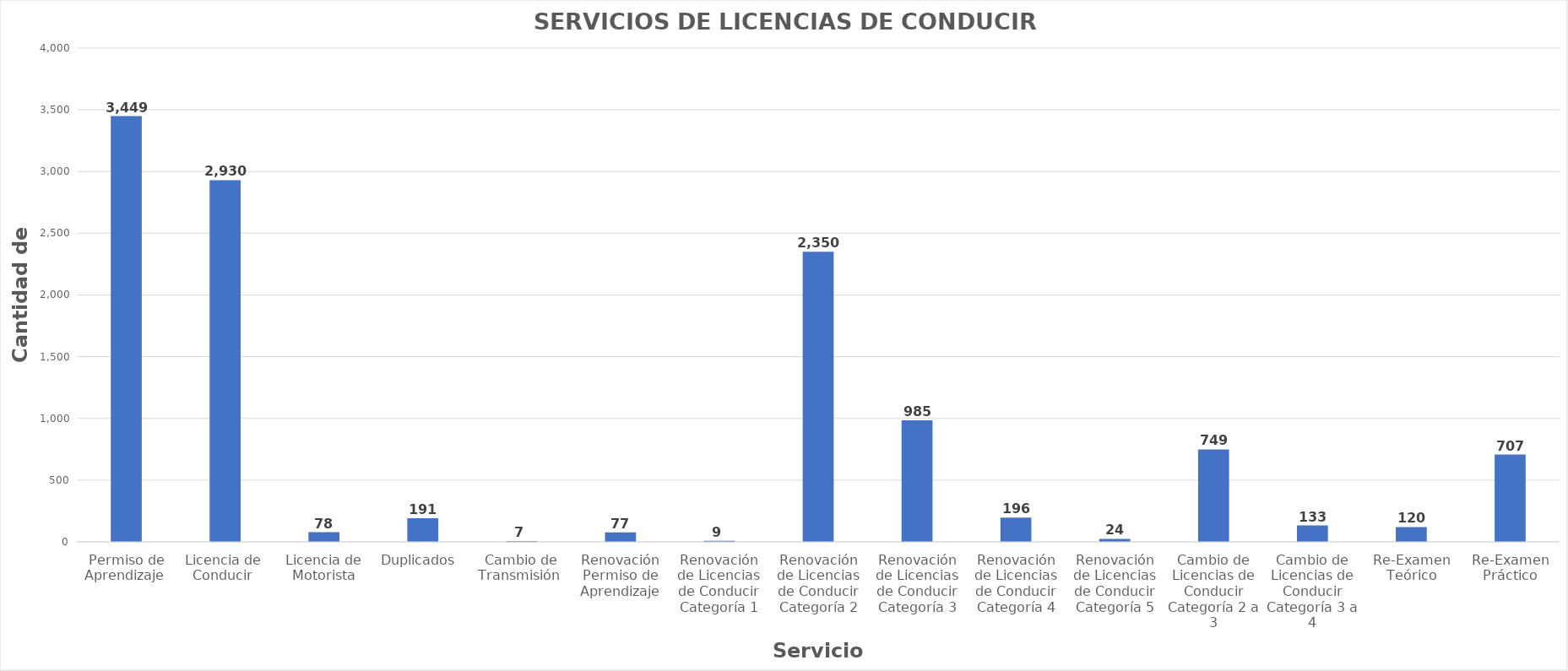
| Category | Series 0 |
|---|---|
| Permiso de Aprendizaje  | 3449 |
| Licencia de  Conducir  | 2930 |
| Licencia de Motorista | 78 |
| Duplicados  | 191 |
| Cambio de Transmisión  | 7 |
| Renovación Permiso de Aprendizaje | 77 |
| Renovación de Licencias de Conducir Categoría 1 | 9 |
| Renovación de Licencias de Conducir Categoría 2 | 2350 |
| Renovación de Licencias de Conducir Categoría 3 | 985 |
| Renovación de Licencias de Conducir Categoría 4 | 196 |
| Renovación de Licencias de Conducir Categoría 5 | 24 |
| Cambio de Licencias de Conducir Categoría 2 a 3 | 749 |
| Cambio de Licencias de Conducir Categoría 3 a 4 | 133 |
| Re-Examen Teórico | 120 |
| Re-Examen Práctico | 707 |